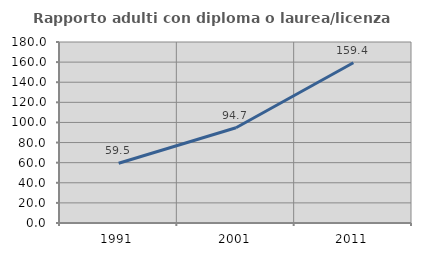
| Category | Rapporto adulti con diploma o laurea/licenza media  |
|---|---|
| 1991.0 | 59.459 |
| 2001.0 | 94.737 |
| 2011.0 | 159.375 |